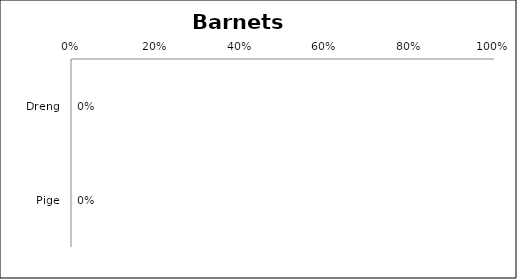
| Category | Barnets køn |
|---|---|
| Dreng | 0 |
| Pige | 0 |